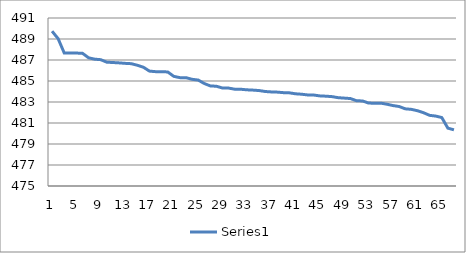
| Category | Series 0 |
|---|---|
| 0 | 489.745 |
| 1 | 489.03 |
| 2 | 487.67 |
| 3 | 487.66 |
| 4 | 487.66 |
| 5 | 487.64 |
| 6 | 487.21 |
| 7 | 487.079 |
| 8 | 487.03 |
| 9 | 486.79 |
| 10 | 486.76 |
| 11 | 486.726 |
| 12 | 486.68 |
| 13 | 486.65 |
| 14 | 486.5 |
| 15 | 486.313 |
| 16 | 485.94 |
| 17 | 485.89 |
| 18 | 485.89 |
| 19 | 485.86 |
| 20 | 485.44 |
| 21 | 485.32 |
| 22 | 485.318 |
| 23 | 485.16 |
| 24 | 485.09 |
| 25 | 484.76 |
| 26 | 484.53 |
| 27 | 484.5 |
| 28 | 484.328 |
| 29 | 484.324 |
| 30 | 484.22 |
| 31 | 484.213 |
| 32 | 484.16 |
| 33 | 484.133 |
| 34 | 484.09 |
| 35 | 484 |
| 36 | 483.96 |
| 37 | 483.94 |
| 38 | 483.89 |
| 39 | 483.87 |
| 40 | 483.78 |
| 41 | 483.74 |
| 42 | 483.67 |
| 43 | 483.66 |
| 44 | 483.58 |
| 45 | 483.554 |
| 46 | 483.51 |
| 47 | 483.41 |
| 48 | 483.37 |
| 49 | 483.329 |
| 50 | 483.12 |
| 51 | 483.1 |
| 52 | 482.894 |
| 53 | 482.89 |
| 54 | 482.89 |
| 55 | 482.787 |
| 56 | 482.66 |
| 57 | 482.57 |
| 58 | 482.35 |
| 59 | 482.3 |
| 60 | 482.17 |
| 61 | 481.98 |
| 62 | 481.73 |
| 63 | 481.66 |
| 64 | 481.52 |
| 65 | 480.51 |
| 66 | 480.35 |